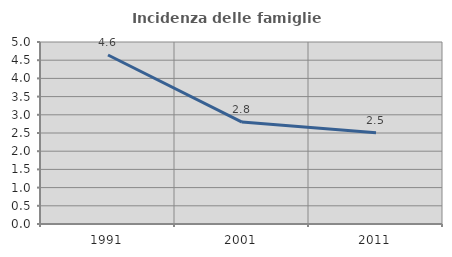
| Category | Incidenza delle famiglie numerose |
|---|---|
| 1991.0 | 4.643 |
| 2001.0 | 2.801 |
| 2011.0 | 2.509 |